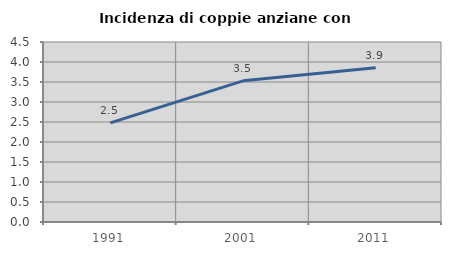
| Category | Incidenza di coppie anziane con figli |
|---|---|
| 1991.0 | 2.478 |
| 2001.0 | 3.529 |
| 2011.0 | 3.858 |